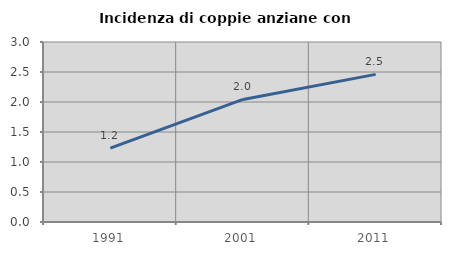
| Category | Incidenza di coppie anziane con figli |
|---|---|
| 1991.0 | 1.231 |
| 2001.0 | 2.043 |
| 2011.0 | 2.461 |